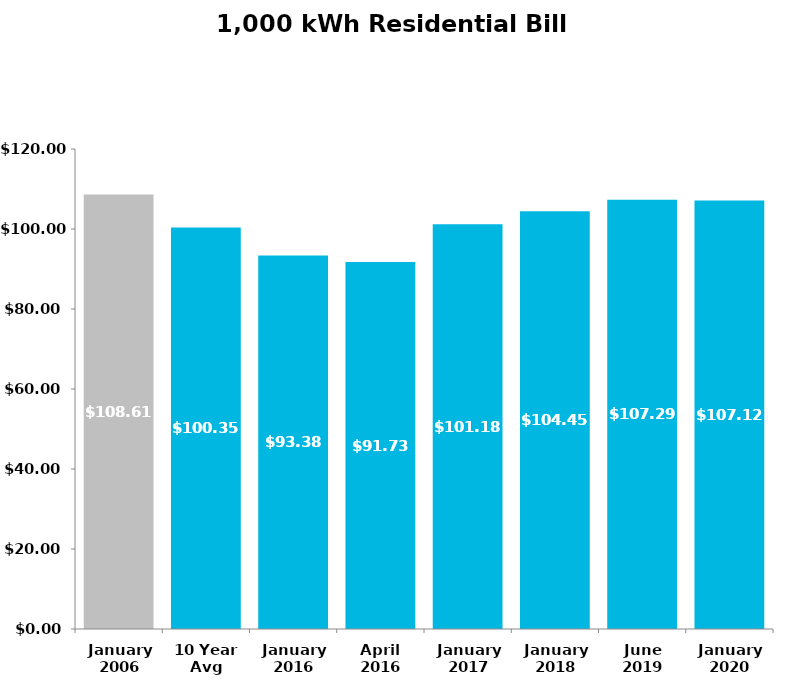
| Category | Total | Series 1 | Series 2 | Series 3 |
|---|---|---|---|---|
| January
2006 | 108.61 |  |  |  |
| 10 Year
Avg | 100.35 |  |  |  |
| January
2016 | 93.38 |  |  |  |
| April
2016 | 91.73 |  |  |  |
| January
2017 | 101.18 |  |  |  |
| January
2018 | 104.45 |  |  |  |
| June
2019 | 107.29 |  |  |  |
| January
2020 | 107.12 |  |  |  |